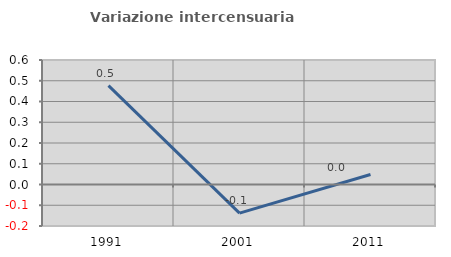
| Category | Variazione intercensuaria annua |
|---|---|
| 1991.0 | 0.477 |
| 2001.0 | -0.138 |
| 2011.0 | 0.048 |